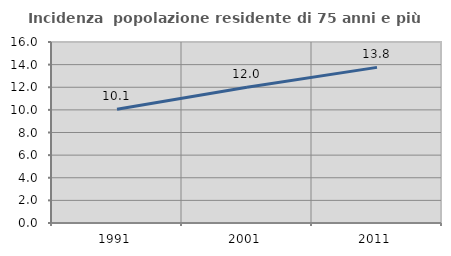
| Category | Incidenza  popolazione residente di 75 anni e più |
|---|---|
| 1991.0 | 10.058 |
| 2001.0 | 12.008 |
| 2011.0 | 13.757 |